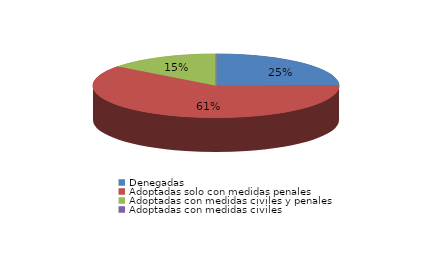
| Category | Series 0 |
|---|---|
| Denegadas | 84 |
| Adoptadas solo con medidas penales | 208 |
| Adoptadas con medidas civiles y penales | 50 |
| Adoptadas con medidas civiles | 0 |